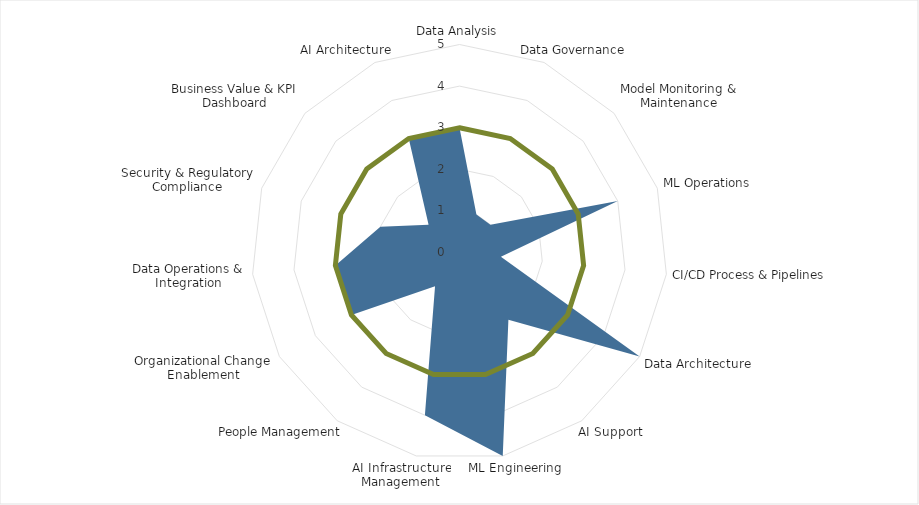
| Category | Series 0 | Team Level Target |
|---|---|---|
| Data Analysis | 3 | 3 |
| Data Governance | 1 | 3 |
| Model Monitoring & Maintenance | 1 | 3 |
| ML Operations | 4 | 3 |
| CI/CD Process & Pipelines | 1 | 3 |
| Data Architecture | 5 | 3 |
| AI Support | 2 | 3 |
| ML Engineering | 5 | 3 |
| AI Infrastructure Management | 4 | 3 |
| People Management | 1 | 3 |
| Organizational Change Enablement | 3 | 3 |
| Data Operations & Integration | 3 | 3 |
| Security & Regulatory Compliance | 2 | 3 |
| Business Value & KPI Dashboard | 1 | 3 |
| AI Architecture | 3 | 3 |